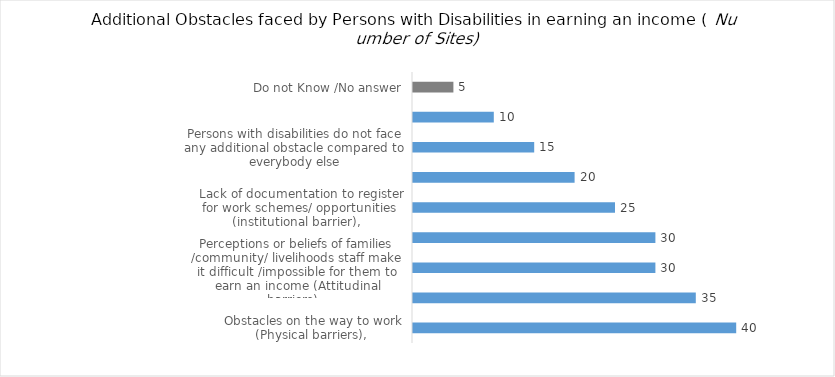
| Category | Additional Obstacles faced by Persons with Disabilities in earning an income |
|---|---|
| Obstacles on the way to work (Physical barriers),  | 40 |
| Obstacles at job site (Physical barriers),  | 35 |
| Perceptions or beliefs of families /community/ livelihoods staff make it difficult /impossible for them to earn an income (Attitudinal barriers),  | 30 |
| Fear of harassment/ violence on the way to work/at work (Attitudinal barriers), | 30 |
|  Lack of documentation to register for work schemes/ opportunities (institutional barrier),  | 25 |
| Persons with disabilities do not have accessible information about work or livelihood opportunities,   | 20 |
| Persons with disabilities do not face any additional obstacle compared to everybody else | 15 |
| Others (specify) | 10 |
| Do not Know /No answer | 5 |